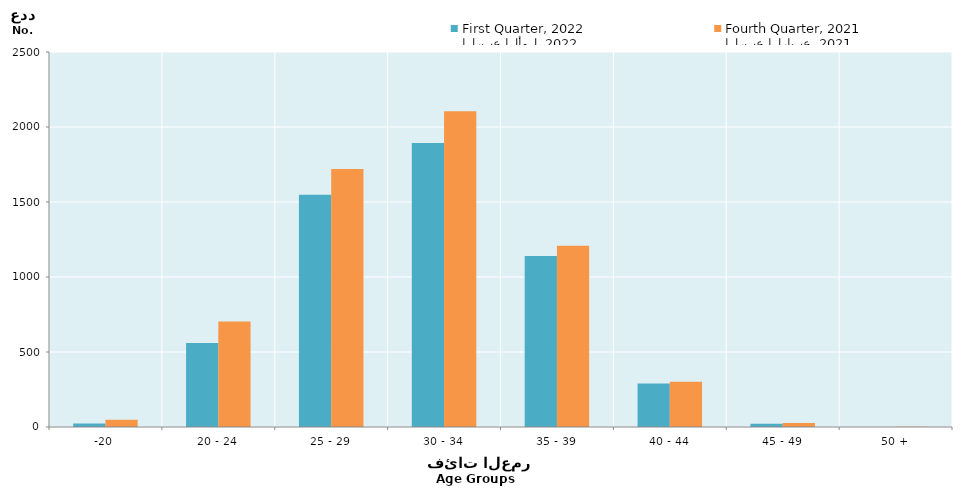
| Category | الربع الأول، 2022
First Quarter, 2022 | الربع الرابع، 2021
Fourth Quarter, 2021 |
|---|---|---|
| -20 | 23 | 49 |
| 20 - 24 | 560 | 704 |
| 25 - 29 | 1549 | 1720 |
| 30 - 34 | 1893 | 2105 |
| 35 - 39 | 1140 | 1208 |
| 40 - 44 | 290 | 302 |
| 45 - 49 | 22 | 26 |
| 50 + | 0 | 1 |